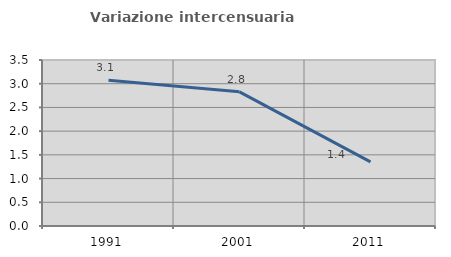
| Category | Variazione intercensuaria annua |
|---|---|
| 1991.0 | 3.071 |
| 2001.0 | 2.828 |
| 2011.0 | 1.352 |